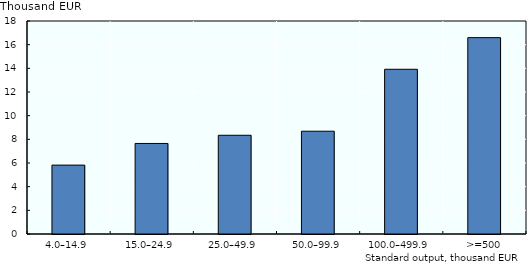
| Category | Gross income per AWU in agricultural farms |
|---|---|
| 4.0–14.9 | 5.822 |
| 15.0–24.9 | 7.651 |
| 25.0–49.9 | 8.343 |
| 50.0–99.9 | 8.686 |
| 100.0–499.9 | 13.921 |
|  >=500 | 16.593 |